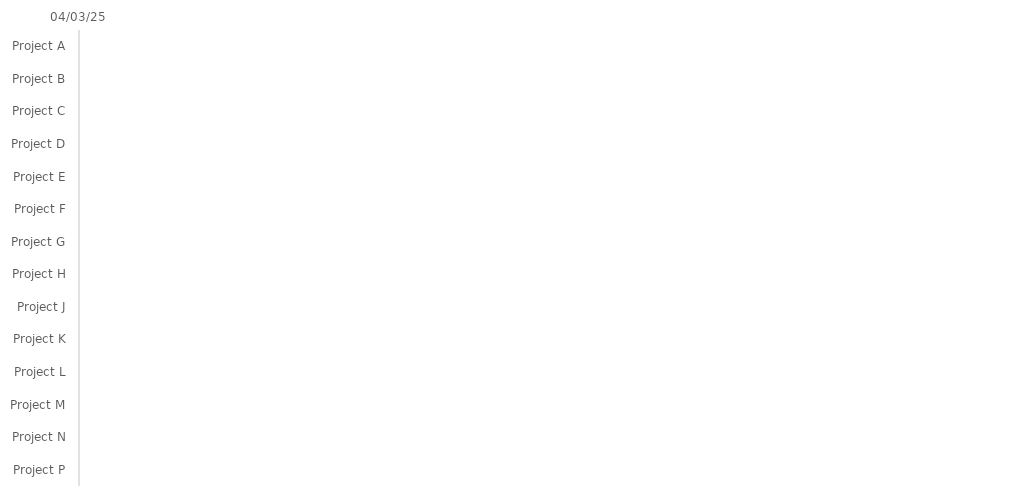
| Category | BEGIN | Duration |
|---|---|---|
| Project A |  | 0 |
| Project B |  | 0 |
| Project C |  | 0 |
| Project D |  | 0 |
| Project E |  | 0 |
| Project F |  | 0 |
| Project G |  | 0 |
| Project H |  | 0 |
| Project J |  | 0 |
| Project K |  | 0 |
| Project L |  | 0 |
| Project M |  | 0 |
| Project N |  | 0 |
| Project P |  | 0 |